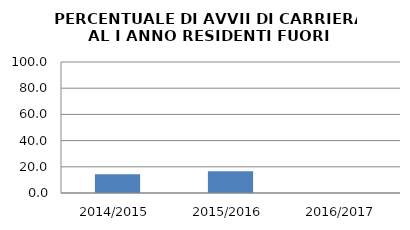
| Category | 2014/2015 2015/2016 2016/2017 |
|---|---|
| 2014/2015 | 14.286 |
| 2015/2016 | 16.667 |
| 2016/2017 | 0 |